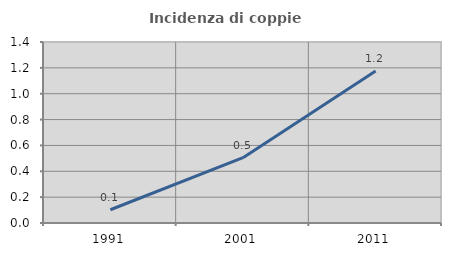
| Category | Incidenza di coppie miste |
|---|---|
| 1991.0 | 0.103 |
| 2001.0 | 0.506 |
| 2011.0 | 1.175 |